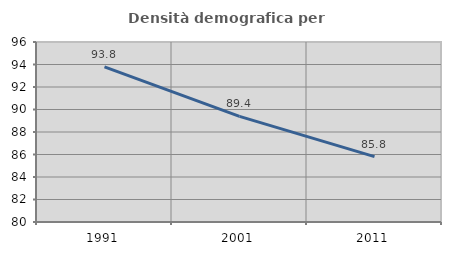
| Category | Densità demografica |
|---|---|
| 1991.0 | 93.786 |
| 2001.0 | 89.394 |
| 2011.0 | 85.815 |